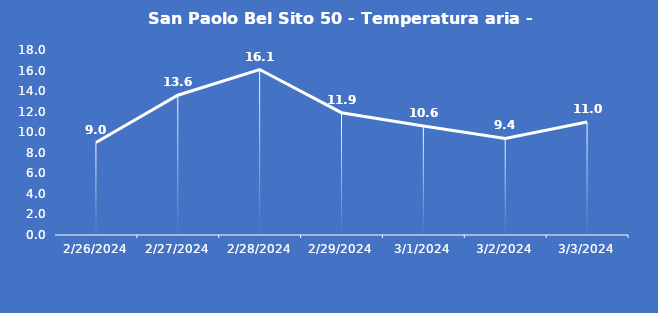
| Category | San Paolo Bel Sito 50 - Temperatura aria - Grezzo (°C) |
|---|---|
| 2/26/24 | 9 |
| 2/27/24 | 13.6 |
| 2/28/24 | 16.1 |
| 2/29/24 | 11.9 |
| 3/1/24 | 10.6 |
| 3/2/24 | 9.4 |
| 3/3/24 | 11 |